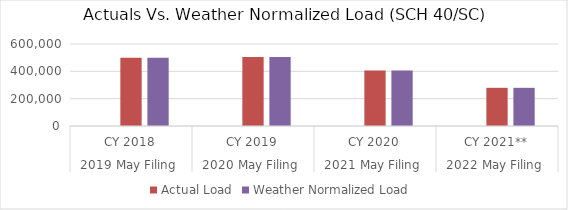
| Category | Residential: SCH 7 | Actual Load | Weather Normalized Load  |
|---|---|---|---|
| 0 |  | 499634.379 | 498811.145 |
| 1 |  | 504624.559 | 504229.469 |
| 2 |  | 406499.816 | 406266.907 |
| 3 |  | 279412.981 | 279412.981 |